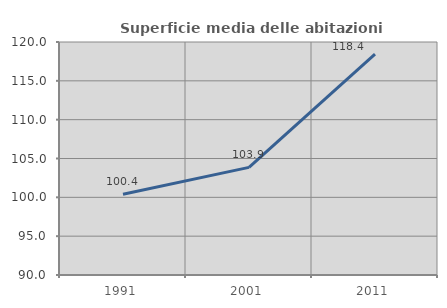
| Category | Superficie media delle abitazioni occupate |
|---|---|
| 1991.0 | 100.408 |
| 2001.0 | 103.859 |
| 2011.0 | 118.433 |